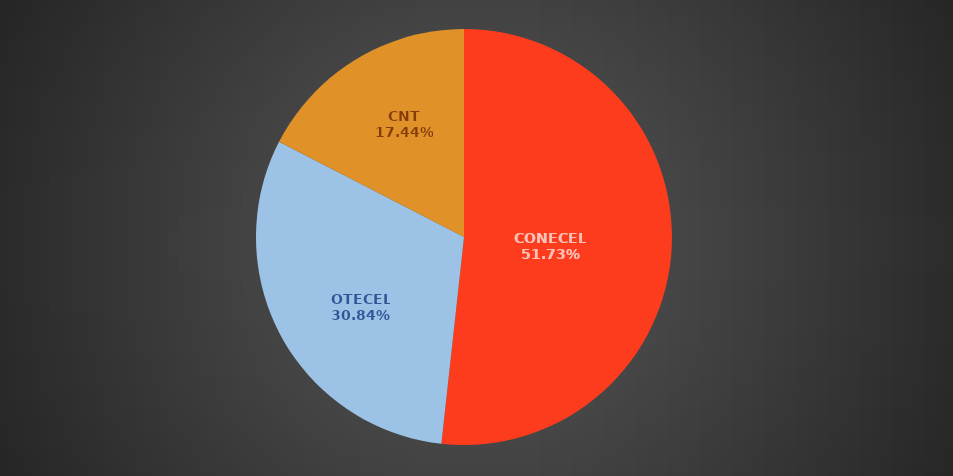
| Category | Jul 2021 |
|---|---|
| CONECEL | 8383604 |
| OTECEL | 4996675 |
| CNT | 2825401 |